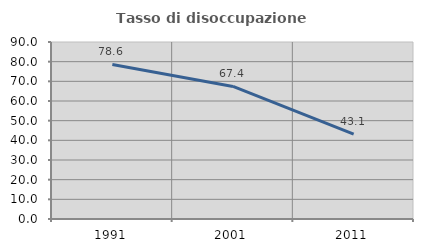
| Category | Tasso di disoccupazione giovanile  |
|---|---|
| 1991.0 | 78.571 |
| 2001.0 | 67.407 |
| 2011.0 | 43.137 |